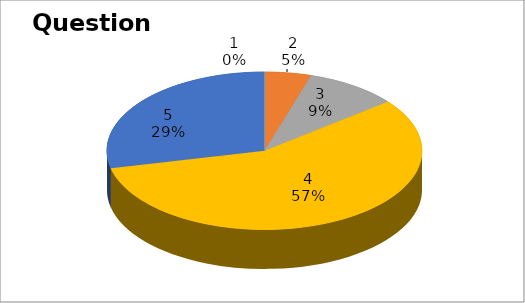
| Category | Series 0 |
|---|---|
| 0 | 0 |
| 1 | 1 |
| 2 | 2 |
| 3 | 12 |
| 4 | 6 |